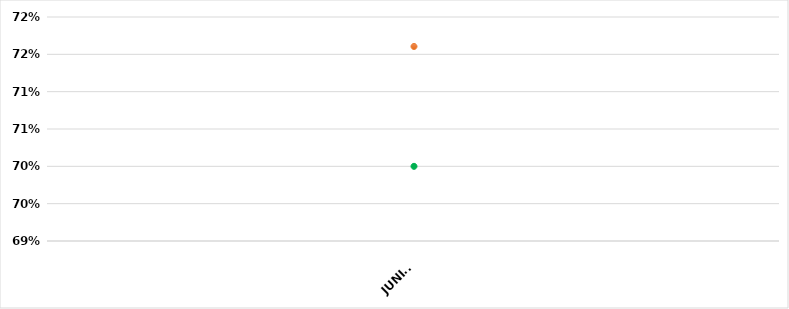
| Category | VALOR  | META PONDERADA |
|---|---|---|
| JUNIO | 0.716 | 0.7 |